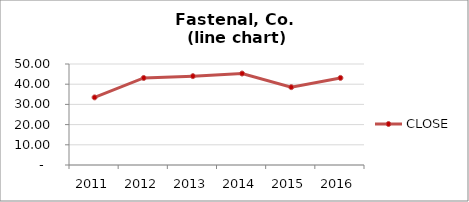
| Category | CLOSE |
|---|---|
| 2011.0 | 33.47 |
| 2012.0 | 43.09 |
| 2013.0 | 43.99 |
| 2014.0 | 45.28 |
| 2015.0 | 38.54 |
| 2016.0 | 43.11 |